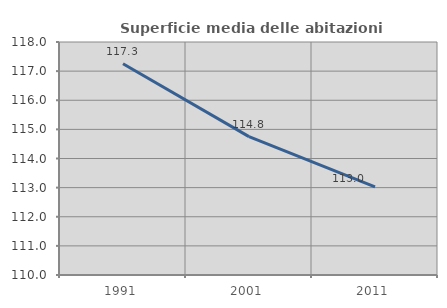
| Category | Superficie media delle abitazioni occupate |
|---|---|
| 1991.0 | 117.256 |
| 2001.0 | 114.75 |
| 2011.0 | 113.023 |